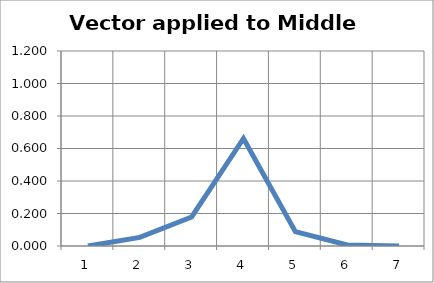
| Category | Series 0 |
|---|---|
| 0 | 0 |
| 1 | 0.053 |
| 2 | 0.179 |
| 3 | 0.662 |
| 4 | 0.088 |
| 5 | 0.006 |
| 6 | 0 |